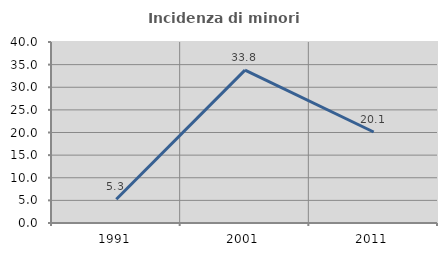
| Category | Incidenza di minori stranieri |
|---|---|
| 1991.0 | 5.263 |
| 2001.0 | 33.793 |
| 2011.0 | 20.109 |